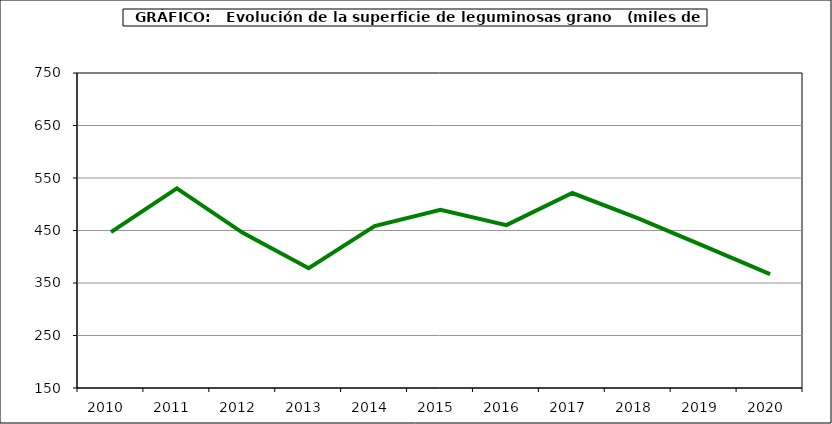
| Category | Superficie |
|---|---|
| 2010.0 | 446.981 |
| 2011.0 | 530.29 |
| 2012.0 | 445.63 |
| 2013.0 | 378.113 |
| 2014.0 | 458.381 |
| 2015.0 | 489.39 |
| 2016.0 | 460.227 |
| 2017.0 | 521.386 |
| 2018.0 | 472.929 |
| 2019.0 | 420.109 |
| 2020.0 | 366.926 |